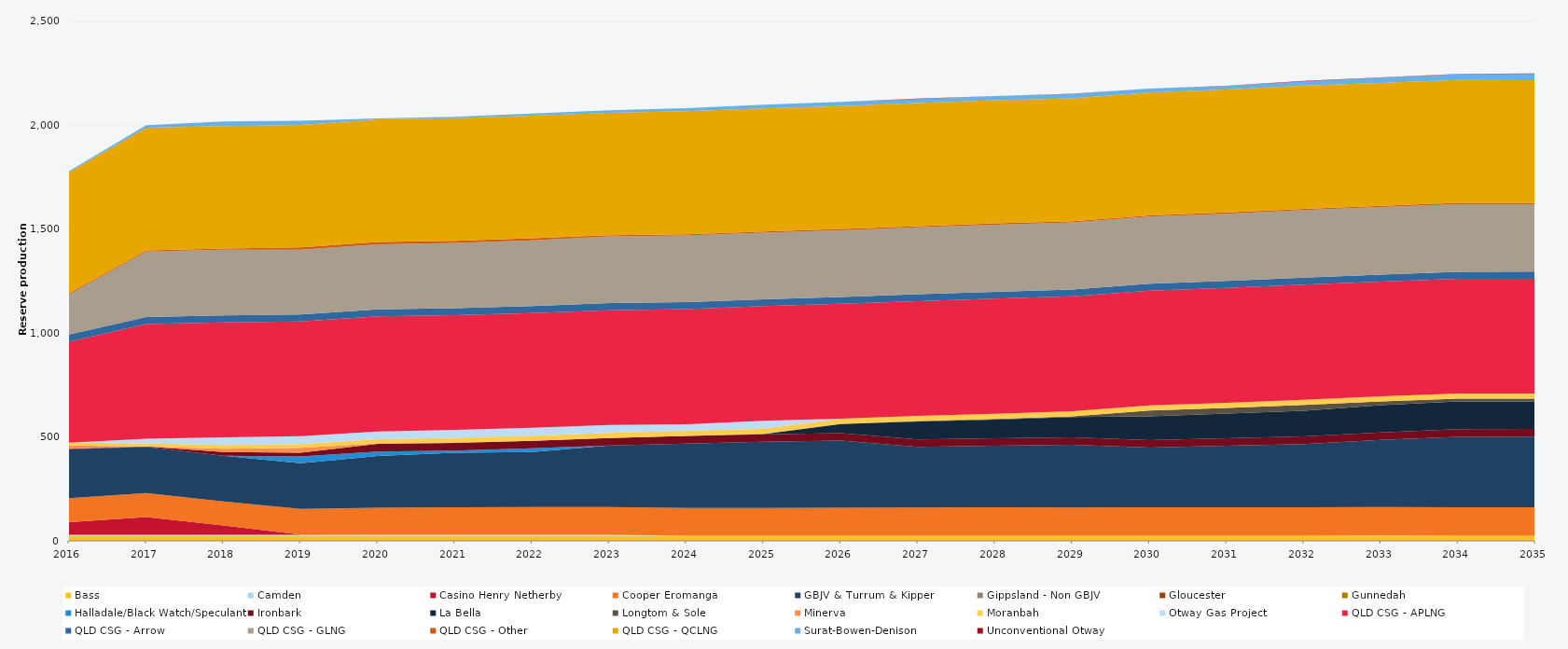
| Category | Bass | Camden | Casino Henry Netherby | Cooper Eromanga | GBJV & Turrum & Kipper | Gippsland - Non GBJV | Gloucester | Gunnedah | Halladale/Black Watch/Speculant | Ironbark | La Bella | Longtom & Sole | Minerva | Moranbah | Otway Gas Project | QLD CSG - APLNG | QLD CSG - Arrow | QLD CSG - GLNG | QLD CSG - Other | QLD CSG - QCLNG | Surat-Bowen-Denison | Unconventional Otway |
|---|---|---|---|---|---|---|---|---|---|---|---|---|---|---|---|---|---|---|---|---|---|---|
| 2016 | 24.522 | 5 | 60.226 | 115.768 | 235.041 | 0 | 0 | 0 | 0 | 2.587 | 0 | 0 | 16 | 13.144 | 0 | 486.482 | 34.038 | 192.994 | 5.856 | 582.664 | 5.579 | 0 |
| 2017 | 24.455 | 5 | 84.98 | 115.078 | 222.562 | 0 | 0 | 0 | 0 | 1.968 | 0 | 0 | 0 | 14.794 | 22.115 | 552.245 | 33.945 | 315.23 | 5.84 | 589.592 | 12.824 | 0 |
| 2018 | 24.455 | 5 | 44.364 | 115.255 | 220 | 0 | 0 | 0 | 0 | 18.089 | 0 | 0 | 15.555 | 17.995 | 38 | 552.245 | 33.945 | 316.32 | 5.84 | 588.744 | 23.202 | 0 |
| 2019 | 24.455 | 5 | 0.69 | 123.776 | 220 | 0 | 0 | 0 | 31.826 | 18.25 | 0 | 0 | 23.725 | 18.062 | 38 | 552.245 | 33.945 | 312.029 | 10.403 | 588.948 | 21.122 | 0 |
| 2020 | 24.522 | 5 | 0 | 130.053 | 248.802 | 0 | 0 | 0 | 21.545 | 36.6 | 0 | 0 | 2.629 | 19.632 | 38 | 553.758 | 34.038 | 313.197 | 10.419 | 591.077 | 4.088 | 0 |
| 2021 | 24.455 | 5 | 0 | 132.173 | 261.97 | 0 | 0 | 0 | 10.636 | 36.5 | 0 | 0 | 2.842 | 22.187 | 38 | 552.245 | 33.945 | 314.213 | 10.403 | 590.252 | 5.698 | 0 |
| 2022 | 24.455 | 5 | 0 | 133.36 | 264.464 | 0 | 0 | 0 | 17.993 | 36.5 | 0 | 0 | 0 | 24.144 | 38 | 552.245 | 33.945 | 315.789 | 10.403 | 590.262 | 9.665 | 0 |
| 2023 | 24.455 | 5 | 0 | 133.541 | 295.675 | 0 | 0 | 0 | 0 | 36.5 | 0 | 0 | 0 | 24.788 | 38 | 552.245 | 33.945 | 320.75 | 5.84 | 589.919 | 11.944 | 0 |
| 2024 | 24.522 | 0 | 0 | 133.356 | 310.296 | 0 | 0 | 0 | 0 | 36.6 | 0 | 0 | 0 | 24.888 | 31.491 | 553.758 | 34.038 | 321.243 | 5.856 | 591.563 | 15.015 | 0 |
| 2025 | 24.455 | 0 | 0 | 134.054 | 318.062 | 0 | 0 | 0 | 0 | 36.5 | 1.302 | 0.678 | 0 | 24.82 | 38 | 552.245 | 32.364 | 320.866 | 5.84 | 591.798 | 18.875 | 0 |
| 2026 | 24.455 | 0 | 0 | 134.586 | 322.91 | 0 | 0 | 0 | 0 | 36.5 | 43.233 | 1.898 | 0 | 24.82 | 0 | 552.245 | 32.779 | 321.744 | 5.84 | 591.755 | 19.952 | 0.308 |
| 2027 | 24.455 | 0 | 0 | 135.887 | 291.795 | 0 | 0 | 0 | 0 | 36.5 | 85.895 | 2.255 | 0 | 24.82 | 0 | 552.245 | 33.074 | 322.385 | 5.84 | 591.711 | 19.981 | 1.565 |
| 2028 | 24.522 | 0 | 0 | 136.618 | 296.342 | 0 | 0 | 0 | 0 | 36.6 | 89.899 | 2.916 | 0 | 24.888 | 0 | 553.758 | 33.226 | 323.324 | 5.856 | 593.257 | 19.506 | 0.615 |
| 2029 | 24.455 | 0 | 0 | 136.513 | 301.181 | 0 | 0 | 0 | 0 | 36.5 | 97.715 | 3.197 | 0 | 24.82 | 0 | 552.245 | 33.357 | 322.634 | 5.84 | 591.623 | 21.122 | 1.309 |
| 2030 | 24.455 | 0 | 0 | 136.875 | 287.047 | 0 | 0 | 0 | 0 | 36.5 | 114.461 | 27.375 | 0 | 24.82 | 0 | 552.245 | 33.558 | 323.492 | 5.84 | 591.579 | 18.421 | 0.573 |
| 2031 | 24.455 | 0 | 0 | 136.875 | 296.13 | 0 | 0 | 0 | 0 | 36.5 | 118.501 | 27.375 | 0 | 24.82 | 0 | 552.245 | 33.706 | 324.058 | 5.84 | 591.535 | 17.516 | 0.526 |
| 2032 | 24.522 | 0.153 | 0 | 137.25 | 303.718 | 0 | 0 | 0 | 0 | 36.6 | 124.316 | 27.45 | 0 | 24.888 | 0 | 553.758 | 33.934 | 325.414 | 5.856 | 593.081 | 21.198 | 1.721 |
| 2033 | 24.455 | 0.847 | 0 | 136.875 | 323.349 | 0 | 0 | 0 | 0 | 36.5 | 130.529 | 18.123 | 0 | 24.82 | 0 | 552.245 | 33.888 | 324.958 | 5.84 | 591.447 | 25.215 | 1.447 |
| 2034 | 24.455 | 0 | 0 | 136.875 | 339.199 | 0 | 0 | 0 | 0 | 36.5 | 134.105 | 13.333 | 0 | 24.82 | 0 | 552.245 | 33.908 | 325.256 | 5.84 | 591.403 | 28.186 | 1.69 |
| 2035 | 24.455 | 0 | 0 | 136.875 | 340.494 | 0 | 0 | 0 | 0 | 36.5 | 132.958 | 13.219 | 0 | 24.82 | 0 | 552.245 | 33.924 | 325.257 | 5.84 | 591.053 | 30.408 | 1.246 |